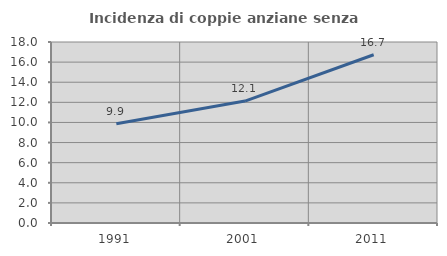
| Category | Incidenza di coppie anziane senza figli  |
|---|---|
| 1991.0 | 9.877 |
| 2001.0 | 12.123 |
| 2011.0 | 16.729 |